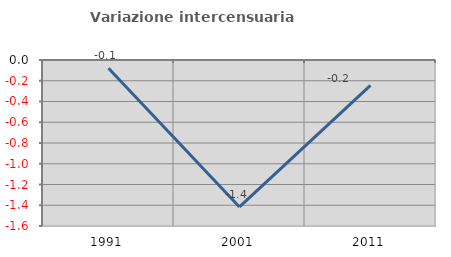
| Category | Variazione intercensuaria annua |
|---|---|
| 1991.0 | -0.08 |
| 2001.0 | -1.417 |
| 2011.0 | -0.244 |